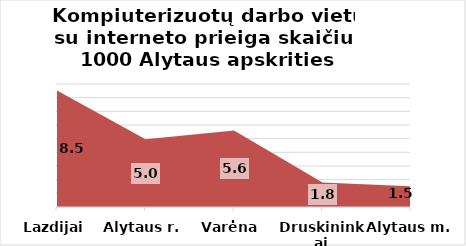
| Category | Series 0 |
|---|---|
| Lazdijai | 8.521 |
| Alytaus r. | 4.953 |
| Varėna | 5.604 |
| Druskininkai | 1.788 |
| Alytaus m. | 1.524 |